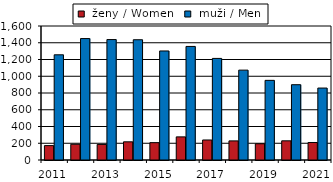
| Category |  ženy / Women  |  muži / Men |
|---|---|---|
| 2011.0 | 172 | 1256 |
| 2012.0 | 188 | 1450 |
| 2013.0 | 186 | 1438 |
| 2014.0 | 217 | 1436 |
| 2015.0 | 207 | 1302 |
| 2016.0 | 276 | 1356 |
| 2017.0 | 239 | 1213 |
| 2018.0 | 228 | 1073 |
| 2019.0 | 194 | 951 |
| 2020.0 | 229 | 899 |
| 2021.0 | 209 | 859 |